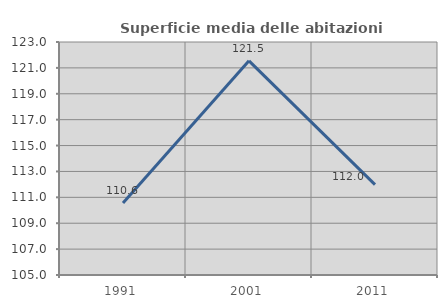
| Category | Superficie media delle abitazioni occupate |
|---|---|
| 1991.0 | 110.562 |
| 2001.0 | 121.547 |
| 2011.0 | 111.978 |